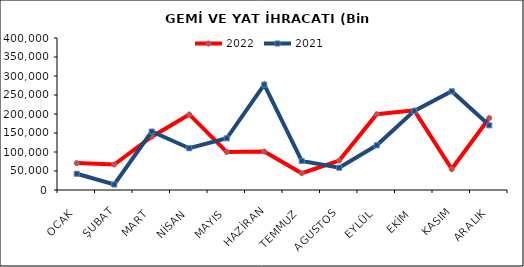
| Category | 2022 | 2021 |
|---|---|---|
| OCAK | 70779.796 | 42744.005 |
| ŞUBAT | 67064.579 | 14435.763 |
| MART | 140232.554 | 153850.518 |
| NİSAN | 198881.657 | 109911.397 |
| MAYIS | 100124.426 | 136047.26 |
| HAZİRAN | 101131.224 | 277348.91 |
| TEMMUZ | 44156.116 | 76572.63 |
| AGUSTOS | 77395.489 | 58623.439 |
| EYLÜL | 199348.733 | 117629.915 |
| EKİM | 209571.999 | 208205.03 |
| KASIM | 55114.955 | 259778.329 |
| ARALIK | 189482.625 | 170121.635 |